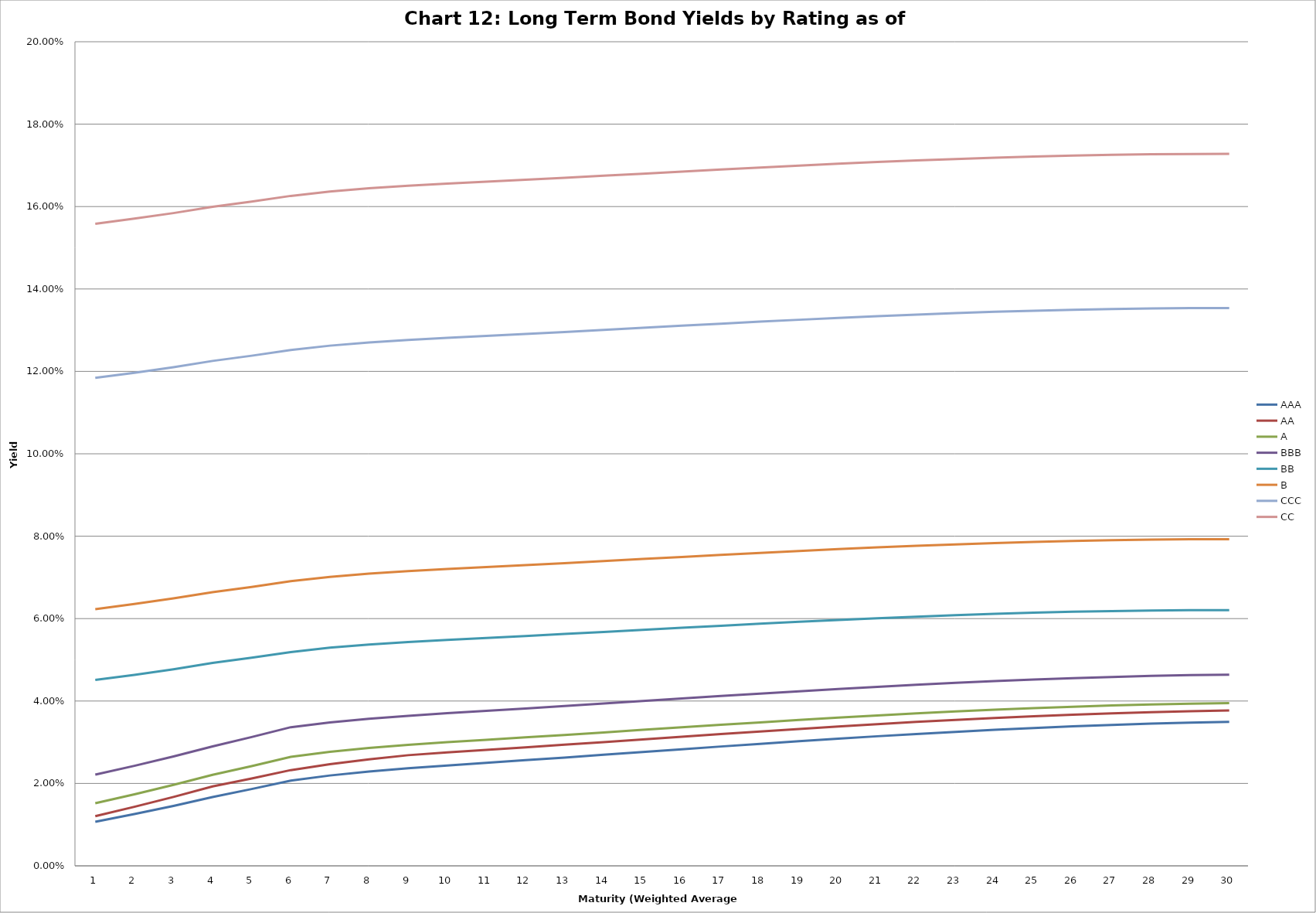
| Category | AAA | AA | A | BBB | BB | B | CCC | CC |
|---|---|---|---|---|---|---|---|---|
| 0 | 0.011 | 0.012 | 0.015 | 0.022 | 0.045 | 0.062 | 0.118 | 0.156 |
| 1 | 0.013 | 0.014 | 0.017 | 0.024 | 0.046 | 0.064 | 0.12 | 0.157 |
| 2 | 0.015 | 0.017 | 0.02 | 0.027 | 0.048 | 0.065 | 0.121 | 0.158 |
| 3 | 0.017 | 0.019 | 0.022 | 0.029 | 0.049 | 0.066 | 0.123 | 0.16 |
| 4 | 0.019 | 0.021 | 0.024 | 0.031 | 0.05 | 0.068 | 0.124 | 0.161 |
| 5 | 0.021 | 0.023 | 0.026 | 0.034 | 0.052 | 0.069 | 0.125 | 0.163 |
| 6 | 0.022 | 0.025 | 0.028 | 0.035 | 0.053 | 0.07 | 0.126 | 0.164 |
| 7 | 0.023 | 0.026 | 0.029 | 0.036 | 0.054 | 0.071 | 0.127 | 0.164 |
| 8 | 0.024 | 0.027 | 0.029 | 0.036 | 0.054 | 0.072 | 0.128 | 0.165 |
| 9 | 0.024 | 0.028 | 0.03 | 0.037 | 0.055 | 0.072 | 0.128 | 0.166 |
| 10 | 0.025 | 0.028 | 0.031 | 0.038 | 0.055 | 0.073 | 0.129 | 0.166 |
| 11 | 0.026 | 0.029 | 0.031 | 0.038 | 0.056 | 0.073 | 0.129 | 0.166 |
| 12 | 0.026 | 0.029 | 0.032 | 0.039 | 0.056 | 0.073 | 0.13 | 0.167 |
| 13 | 0.027 | 0.03 | 0.032 | 0.039 | 0.057 | 0.074 | 0.13 | 0.167 |
| 14 | 0.028 | 0.031 | 0.033 | 0.04 | 0.057 | 0.074 | 0.131 | 0.168 |
| 15 | 0.028 | 0.031 | 0.034 | 0.041 | 0.058 | 0.075 | 0.131 | 0.168 |
| 16 | 0.029 | 0.032 | 0.034 | 0.041 | 0.058 | 0.075 | 0.132 | 0.169 |
| 17 | 0.03 | 0.033 | 0.035 | 0.042 | 0.059 | 0.076 | 0.132 | 0.169 |
| 18 | 0.03 | 0.033 | 0.035 | 0.042 | 0.059 | 0.076 | 0.133 | 0.17 |
| 19 | 0.031 | 0.034 | 0.036 | 0.043 | 0.06 | 0.077 | 0.133 | 0.17 |
| 20 | 0.031 | 0.034 | 0.036 | 0.043 | 0.06 | 0.077 | 0.133 | 0.171 |
| 21 | 0.032 | 0.035 | 0.037 | 0.044 | 0.06 | 0.078 | 0.134 | 0.171 |
| 22 | 0.033 | 0.035 | 0.037 | 0.044 | 0.061 | 0.078 | 0.134 | 0.172 |
| 23 | 0.033 | 0.036 | 0.038 | 0.045 | 0.061 | 0.078 | 0.134 | 0.172 |
| 24 | 0.033 | 0.036 | 0.038 | 0.045 | 0.061 | 0.079 | 0.135 | 0.172 |
| 25 | 0.034 | 0.037 | 0.039 | 0.046 | 0.062 | 0.079 | 0.135 | 0.172 |
| 26 | 0.034 | 0.037 | 0.039 | 0.046 | 0.062 | 0.079 | 0.135 | 0.173 |
| 27 | 0.035 | 0.037 | 0.039 | 0.046 | 0.062 | 0.079 | 0.135 | 0.173 |
| 28 | 0.035 | 0.038 | 0.039 | 0.046 | 0.062 | 0.079 | 0.135 | 0.173 |
| 29 | 0.035 | 0.038 | 0.039 | 0.046 | 0.062 | 0.079 | 0.135 | 0.173 |